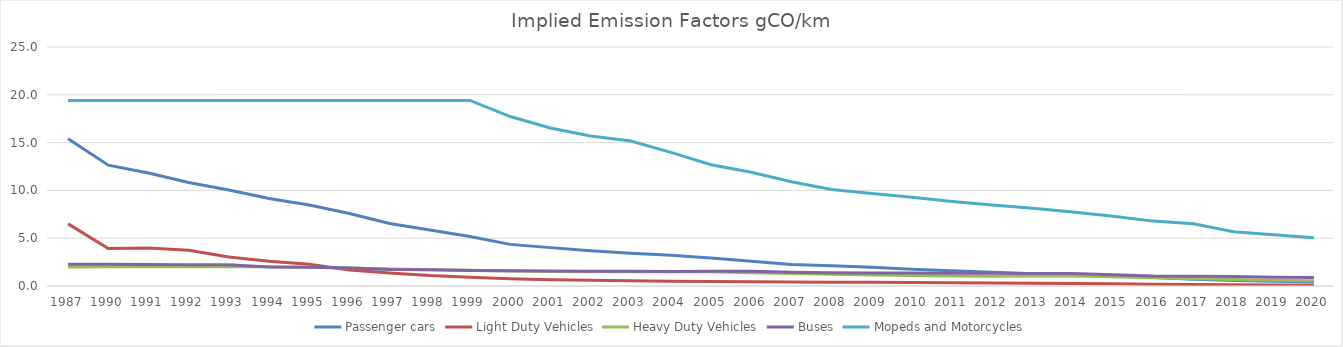
| Category | Passenger cars | Light Duty Vehicles | Heavy Duty Vehicles | Buses | Mopeds and Motorcycles |
|---|---|---|---|---|---|
| 1987.0 | 15.395 | 6.498 | 1.989 | 2.263 | 19.411 |
| 1990.0 | 12.635 | 3.921 | 2.01 | 2.267 | 19.411 |
| 1991.0 | 11.819 | 3.973 | 2.004 | 2.252 | 19.411 |
| 1992.0 | 10.835 | 3.745 | 2.008 | 2.214 | 19.411 |
| 1993.0 | 10.043 | 3.036 | 2.008 | 2.214 | 19.411 |
| 1994.0 | 9.162 | 2.6 | 2.007 | 1.978 | 19.411 |
| 1995.0 | 8.471 | 2.268 | 1.957 | 1.949 | 19.411 |
| 1996.0 | 7.576 | 1.67 | 1.878 | 1.892 | 19.411 |
| 1997.0 | 6.539 | 1.357 | 1.787 | 1.737 | 19.411 |
| 1998.0 | 5.851 | 1.087 | 1.707 | 1.697 | 19.411 |
| 1999.0 | 5.168 | 0.916 | 1.646 | 1.634 | 19.411 |
| 2000.0 | 4.354 | 0.765 | 1.576 | 1.592 | 17.725 |
| 2001.0 | 4.014 | 0.66 | 1.52 | 1.563 | 16.534 |
| 2002.0 | 3.675 | 0.594 | 1.499 | 1.553 | 15.684 |
| 2003.0 | 3.425 | 0.545 | 1.492 | 1.538 | 15.172 |
| 2004.0 | 3.21 | 0.506 | 1.482 | 1.526 | 13.975 |
| 2005.0 | 2.931 | 0.473 | 1.499 | 1.536 | 12.682 |
| 2006.0 | 2.586 | 0.44 | 1.395 | 1.532 | 11.893 |
| 2007.0 | 2.257 | 0.414 | 1.315 | 1.451 | 10.903 |
| 2008.0 | 2.123 | 0.395 | 1.218 | 1.392 | 10.095 |
| 2009.0 | 1.952 | 0.384 | 1.141 | 1.357 | 9.679 |
| 2010.0 | 1.755 | 0.373 | 1.086 | 1.348 | 9.292 |
| 2011.0 | 1.589 | 0.349 | 1.034 | 1.339 | 8.843 |
| 2012.0 | 1.426 | 0.322 | 1.026 | 1.326 | 8.479 |
| 2013.0 | 1.276 | 0.301 | 1.042 | 1.31 | 8.141 |
| 2014.0 | 1.148 | 0.274 | 1.054 | 1.296 | 7.746 |
| 2015.0 | 1.04 | 0.242 | 0.955 | 1.181 | 7.304 |
| 2016.0 | 0.897 | 0.194 | 0.854 | 1.035 | 6.787 |
| 2017.0 | 0.698 | 0.164 | 0.762 | 1.028 | 6.515 |
| 2018.0 | 0.58 | 0.132 | 0.672 | 0.987 | 5.676 |
| 2019.0 | 0.485 | 0.108 | 0.592 | 0.916 | 5.367 |
| 2020.0 | 0.413 | 0.089 | 0.549 | 0.886 | 5.056 |